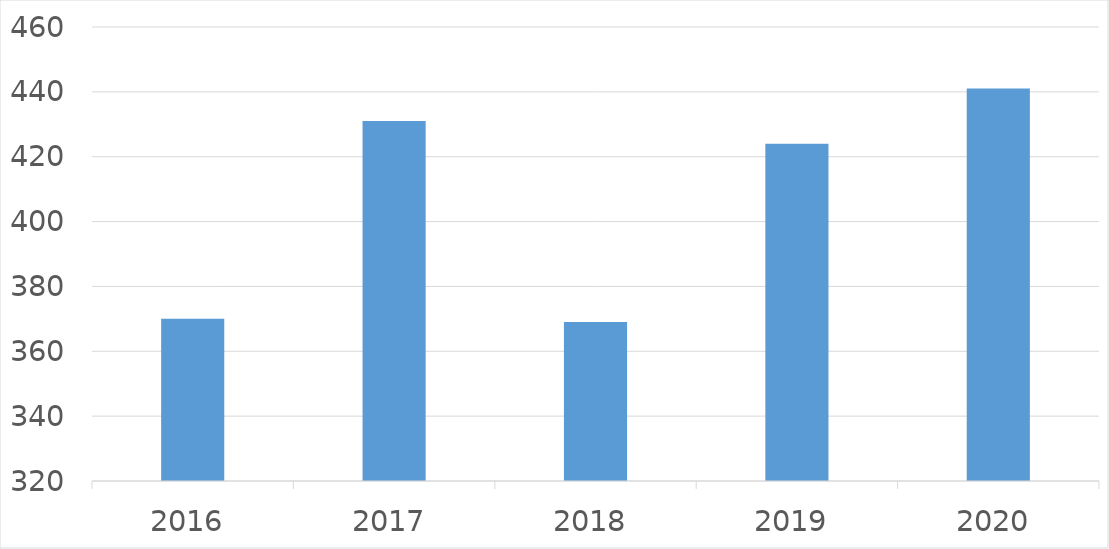
| Category | Series 0 |
|---|---|
| 2016 | 370 |
| 2017 | 431 |
| 2018 | 369 |
| 2019 | 424 |
| 2020 | 441 |